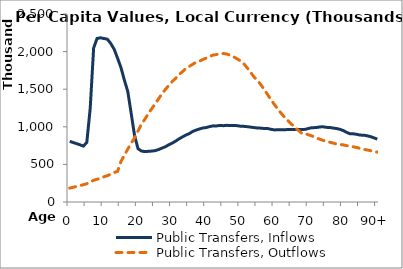
| Category | Public Transfers, Inflows | Public Transfers, Outflows |
|---|---|---|
| 0 | 805964.963 | 184603.034 |
|  | 791180.396 | 195867.028 |
| 2 | 776395.83 | 207131.021 |
| 3 | 760588.867 | 218395.015 |
| 4 | 743847.867 | 229659.008 |
| 5 | 791210.75 | 243160.44 |
| 6 | 1245447.72 | 264604.612 |
| 7 | 2047182.86 | 288885.198 |
| 8 | 2174600.866 | 302514.573 |
| 9 | 2183592.42 | 314880.224 |
| 10 | 2174117.427 | 335088.599 |
| 11 | 2165501.708 | 349479.631 |
| 12 | 2108706.778 | 370176.131 |
| 13 | 2032082.204 | 392362.782 |
| 14 | 1912694.043 | 406949.973 |
| 15 | 1787241.855 | 538691.861 |
| 16 | 1619792.606 | 624679.279 |
| 17 | 1468523.416 | 704401.518 |
| 18 | 1173786.069 | 780566.828 |
| 19 | 877229.3 | 856040.812 |
| 20 | 708469.145 | 945381.959 |
| 21 | 678012.583 | 1036122.779 |
| 22 | 669834.246 | 1101164.428 |
| 23 | 673899.404 | 1175414.241 |
| 24 | 677019.804 | 1240608.108 |
| 25 | 683117.198 | 1305220.185 |
| 26 | 697274.916 | 1372588.138 |
| 27 | 716756.184 | 1439011.427 |
| 28 | 734845.773 | 1497053.218 |
| 29 | 761553.705 | 1551766.73 |
| 30 | 783204.387 | 1600738.334 |
| 31 | 809773.787 | 1645687.437 |
| 32 | 839716.89 | 1694000.197 |
| 33 | 865653.994 | 1733516.589 |
| 34 | 890603.03 | 1775311.641 |
| 35 | 909600.646 | 1803169.243 |
| 36 | 938697.691 | 1832089.708 |
| 37 | 956187.357 | 1858541.802 |
| 38 | 971582.259 | 1872628.337 |
| 39 | 984738.268 | 1895376.859 |
| 40 | 990403.135 | 1915146.076 |
| 41 | 1003732.724 | 1937680.795 |
| 42 | 1012401.61 | 1953903.134 |
| 43 | 1011821.382 | 1961440.647 |
| 44 | 1018935.345 | 1972997.752 |
| 45 | 1014718.667 | 1974637.992 |
| 46 | 1019655.418 | 1967137.535 |
| 47 | 1016167.12 | 1949309.111 |
| 48 | 1017181.675 | 1929321.286 |
| 49 | 1015155.569 | 1902962.724 |
| 50 | 1007351.784 | 1876536.694 |
| 51 | 1005694.757 | 1835613.617 |
| 52 | 1001443.868 | 1779939.014 |
| 53 | 995130.663 | 1720465.532 |
| 54 | 989488.382 | 1659126.746 |
| 55 | 983554.801 | 1613463.569 |
| 56 | 982014.483 | 1555129.788 |
| 57 | 977163.49 | 1491041.617 |
| 58 | 976242.219 | 1421429.172 |
| 59 | 965789.969 | 1351937.607 |
| 60 | 958112.916 | 1290785.972 |
| 61 | 962446.643 | 1226872.88 |
| 62 | 960738.296 | 1173417.947 |
| 63 | 960413.68 | 1120211.945 |
| 64 | 965719.784 | 1075243.249 |
| 65 | 963809.393 | 1030759.007 |
| 66 | 964025.08 | 986369.762 |
| 67 | 962668.642 | 949706.532 |
| 68 | 964368.908 | 909286.421 |
| 69 | 966205.97 | 906847.968 |
| 70 | 979979.666 | 891960.522 |
| 71 | 988467.619 | 876955.997 |
| 72 | 989308.674 | 853741.299 |
| 73 | 996543.93 | 838136.335 |
| 74 | 1001710.919 | 821654.548 |
| 75 | 992466.226 | 807281.348 |
| 76 | 992022.663 | 795292.216 |
| 77 | 983861.074 | 785033.908 |
| 78 | 977561.465 | 771140.572 |
| 79 | 967207.375 | 766109.103 |
| 80 | 950567.26 | 759976.085 |
| 81 | 926727.878 | 750087.006 |
| 82 | 907370.001 | 742402.388 |
| 83 | 906469.856 | 733809.693 |
| 84 | 899460.494 | 724770.87 |
| 85 | 889413.16 | 712387.857 |
| 86 | 888963.97 | 701503.084 |
| 87 | 880695.245 | 692079.083 |
| 88 | 869640.33 | 682655.082 |
| 89 | 853280.642 | 673231.081 |
| 90+ | 836150.243 | 663807.08 |